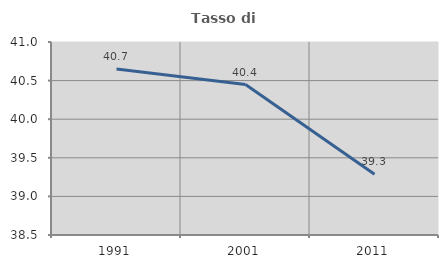
| Category | Tasso di occupazione   |
|---|---|
| 1991.0 | 40.65 |
| 2001.0 | 40.449 |
| 2011.0 | 39.286 |